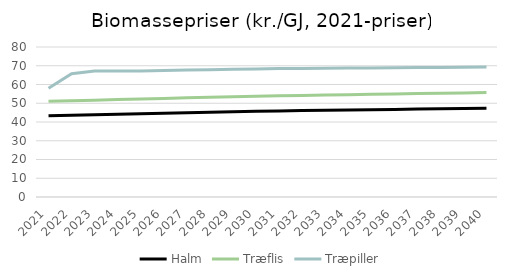
| Category | Halm | Træflis | Træpiller |
|---|---|---|---|
| 2021.0 | 43.345 | 51.006 | 57.949 |
| 2022.0 | 43.621 | 51.329 | 65.771 |
| 2023.0 | 43.904 | 51.66 | 67.243 |
| 2024.0 | 44.182 | 51.985 | 67.237 |
| 2025.0 | 44.451 | 52.299 | 67.221 |
| 2026.0 | 44.706 | 52.597 | 67.451 |
| 2027.0 | 44.959 | 52.892 | 67.675 |
| 2028.0 | 45.21 | 53.186 | 67.897 |
| 2029.0 | 45.459 | 53.476 | 68.112 |
| 2030.0 | 45.704 | 53.763 | 68.321 |
| 2031.0 | 45.902 | 53.994 | 68.471 |
| 2032.0 | 46.071 | 54.191 | 68.571 |
| 2033.0 | 46.237 | 54.385 | 68.666 |
| 2034.0 | 46.401 | 54.577 | 68.757 |
| 2035.0 | 46.563 | 54.766 | 68.842 |
| 2036.0 | 46.727 | 54.958 | 68.933 |
| 2037.0 | 46.894 | 55.153 | 69.027 |
| 2038.0 | 47.058 | 55.344 | 69.116 |
| 2039.0 | 47.219 | 55.533 | 69.2 |
| 2040.0 | 47.378 | 55.718 | 69.28 |